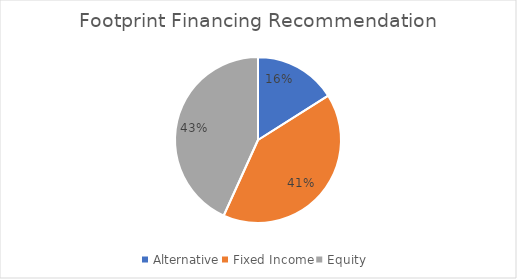
| Category | Series 0 |
|---|---|
| Alternative | 55354040 |
| Fixed Income | 140593740 |
| Equity | 149152220 |